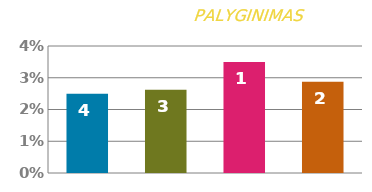
| Category | TARIFAS |
|---|---|
| 0 | 0.025 |
| 1 | 0.026 |
| 2 | 0.035 |
| 3 | 0.029 |